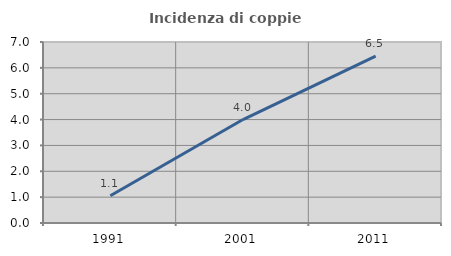
| Category | Incidenza di coppie miste |
|---|---|
| 1991.0 | 1.053 |
| 2001.0 | 4 |
| 2011.0 | 6.452 |